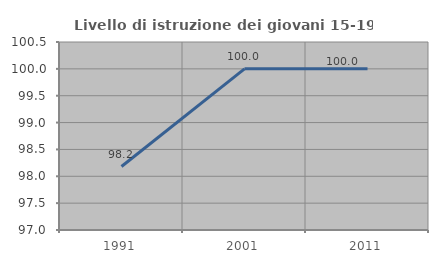
| Category | Livello di istruzione dei giovani 15-19 anni |
|---|---|
| 1991.0 | 98.182 |
| 2001.0 | 100 |
| 2011.0 | 100 |